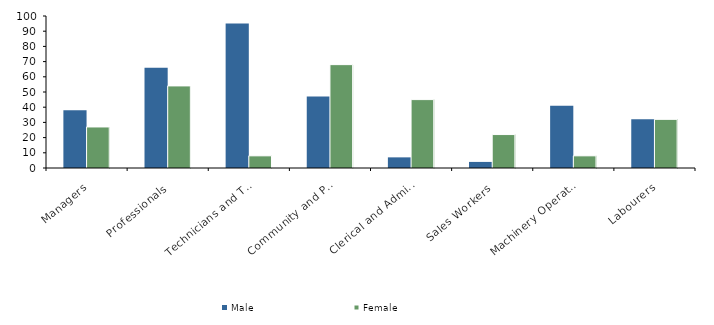
| Category | Male | Female |
|---|---|---|
| Managers | 38 | 27 |
| Professionals | 66 | 54 |
| Technicians and Trades Workers | 95 | 8 |
| Community and Personal Service Workers | 47 | 68 |
| Clerical and Administrative Workers | 7 | 45 |
| Sales Workers | 4 | 22 |
| Machinery Operators and Drivers | 41 | 8 |
| Labourers | 32 | 32 |